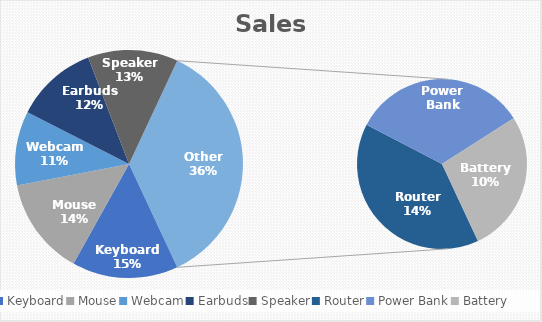
| Category | Sales |
|---|---|
| Keyboard | 20000 |
| Mouse | 18500 |
| Webcam | 14000 |
| Earbuds | 15500 |
| Speaker | 17000 |
| Router | 19000 |
| Power Bank | 16000 |
| Battery | 13000 |